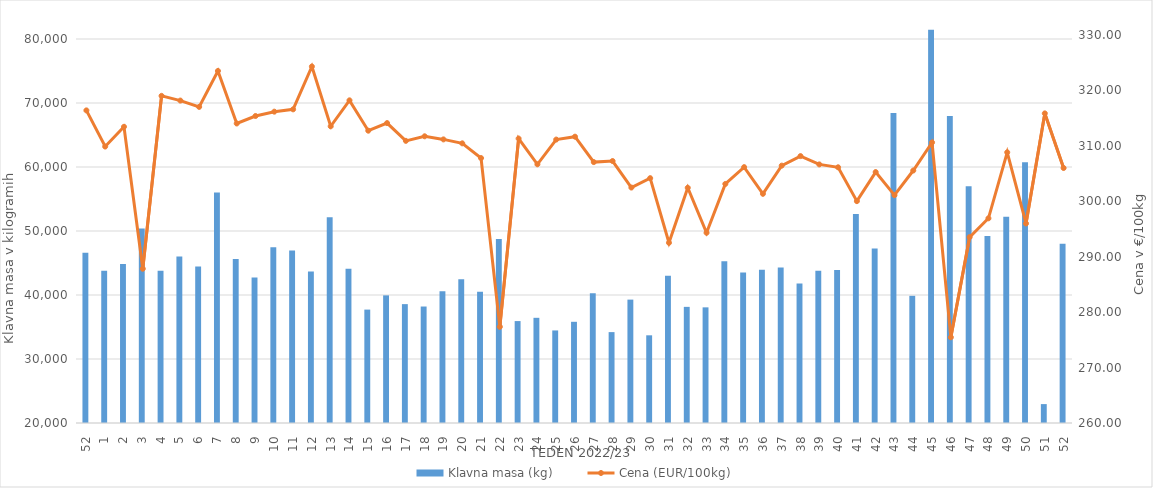
| Category | Klavna masa (kg) |
|---|---|
| 52.0 | 46589 |
| 1.0 | 43807 |
| 2.0 | 44834 |
| 3.0 | 50386 |
| 4.0 | 43773 |
| 5.0 | 46011 |
| 6.0 | 44439 |
| 7.0 | 56001 |
| 8.0 | 45613 |
| 9.0 | 42730 |
| 10.0 | 47471 |
| 11.0 | 46952 |
| 12.0 | 43683 |
| 13.0 | 52135 |
| 14.0 | 44103 |
| 15.0 | 37719 |
| 16.0 | 39943 |
| 17.0 | 38574 |
| 18.0 | 38200 |
| 19.0 | 40581 |
| 20.0 | 42443 |
| 21.0 | 40517 |
| 22.0 | 48742 |
| 23.0 | 35927 |
| 24.0 | 36436 |
| 25.0 | 34463 |
| 26.0 | 35812 |
| 27.0 | 40280 |
| 28.0 | 34201 |
| 29.0 | 39279 |
| 30.0 | 33702 |
| 31.0 | 43020 |
| 32.0 | 38146 |
| 33.0 | 38070 |
| 34.0 | 45290 |
| 35.0 | 43513 |
| 36.0 | 43945 |
| 37.0 | 44302 |
| 38.0 | 41798 |
| 39.0 | 43790 |
| 40.0 | 43913 |
| 41.0 | 52663 |
| 42.0 | 47275 |
| 43.0 | 68419 |
| 44.0 | 39872 |
| 45.0 | 81439 |
| 46.0 | 67983 |
| 47.0 | 57006 |
| 48.0 | 49204 |
| 49.0 | 52219 |
| 50.0 | 60759 |
| 51.0 | 22954 |
| 52.0 | 48002 |